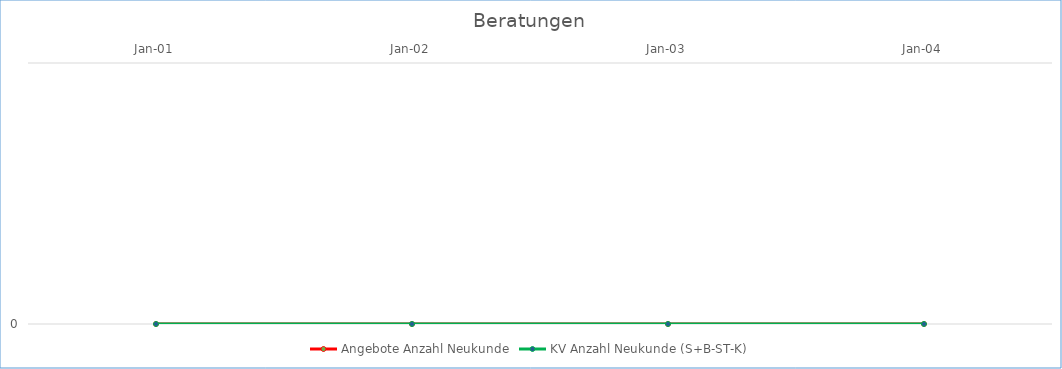
| Category | Angebote Anzahl Neukunde | KV Anzahl Neukunde (S+B-ST-K) |
|---|---|---|
| 2001-01-01 | 0 | 0 |
| 2002-01-01 | 0 | 0 |
| 2003-01-01 | 0 | 0 |
| 2004-01-01 | 0 | 0 |